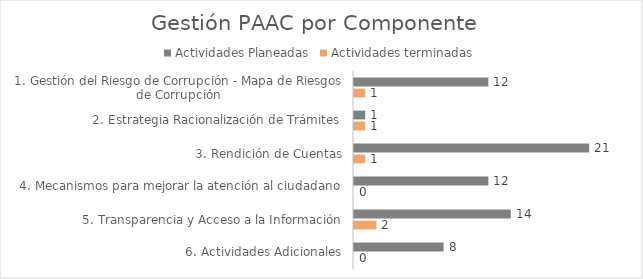
| Category | Actividades Planeadas | Actividades terminadas |
|---|---|---|
| 1. Gestión del Riesgo de Corrupción - Mapa de Riesgos de Corrupción | 12 | 1 |
| 2. Estrategia Racionalización de Trámites | 1 | 1 |
| 3. Rendición de Cuentas | 21 | 1 |
| 4. Mecanismos para mejorar la atención al ciudadano | 12 | 0 |
| 5. Transparencia y Acceso a la Información | 14 | 2 |
| 6. Actividades Adicionales | 8 | 0 |